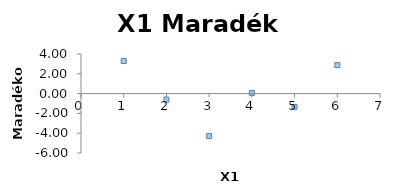
| Category | Series 0 |
|---|---|
| 1.0 | 3.3 |
| 2.0 | -0.606 |
| 3.0 | -4.288 |
| 4.0 | 0.068 |
| 5.0 | -1.346 |
| 6.0 | 2.872 |